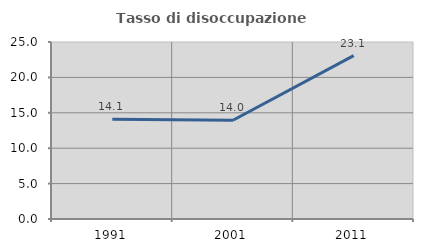
| Category | Tasso di disoccupazione giovanile  |
|---|---|
| 1991.0 | 14.088 |
| 2001.0 | 13.953 |
| 2011.0 | 23.077 |